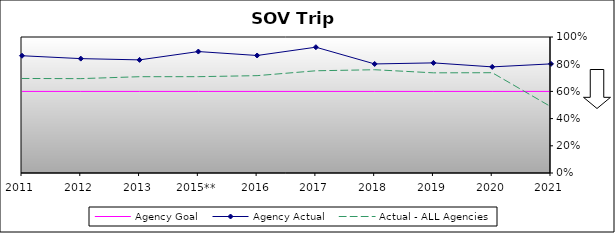
| Category | Agency Goal | Agency Actual | Actual - ALL Agencies |
|---|---|---|---|
| 2011 | 0.6 | 0.862 | 0.695 |
| 2012 | 0.6 | 0.841 | 0.694 |
| 2013 | 0.6 | 0.832 | 0.708 |
| 2015** | 0.6 | 0.893 | 0.708 |
| 2016 | 0.6 | 0.864 | 0.716 |
| 2017 | 0.6 | 0.925 | 0.752 |
| 2018 | 0.6 | 0.802 | 0.759 |
| 2019 | 0.6 | 0.81 | 0.736 |
| 2020 | 0.6 | 0.78 | 0.737 |
| 2021 | 0.6 | 0.802 | 0.487 |